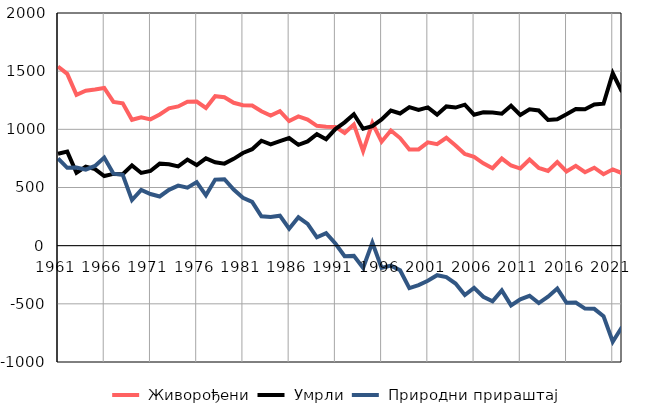
| Category |  Живорођени |  Умрли |  Природни прираштај |
|---|---|---|---|
| 1961.0 | 1540 | 790 | 750 |
| 1962.0 | 1477 | 808 | 669 |
| 1963.0 | 1297 | 626 | 671 |
| 1964.0 | 1332 | 679 | 653 |
| 1965.0 | 1343 | 658 | 685 |
| 1966.0 | 1356 | 599 | 757 |
| 1967.0 | 1236 | 617 | 619 |
| 1968.0 | 1223 | 614 | 609 |
| 1969.0 | 1082 | 690 | 392 |
| 1970.0 | 1104 | 625 | 479 |
| 1971.0 | 1086 | 642 | 444 |
| 1972.0 | 1128 | 705 | 423 |
| 1973.0 | 1180 | 700 | 480 |
| 1974.0 | 1197 | 681 | 516 |
| 1975.0 | 1238 | 740 | 498 |
| 1976.0 | 1239 | 693 | 546 |
| 1977.0 | 1184 | 751 | 433 |
| 1978.0 | 1285 | 717 | 568 |
| 1979.0 | 1276 | 705 | 571 |
| 1980.0 | 1228 | 746 | 482 |
| 1981.0 | 1208 | 797 | 411 |
| 1982.0 | 1205 | 829 | 376 |
| 1983.0 | 1155 | 902 | 253 |
| 1984.0 | 1118 | 871 | 247 |
| 1985.0 | 1156 | 898 | 258 |
| 1986.0 | 1071 | 925 | 146 |
| 1987.0 | 1111 | 867 | 244 |
| 1988.0 | 1083 | 896 | 187 |
| 1989.0 | 1030 | 958 | 72 |
| 1990.0 | 1023 | 915 | 108 |
| 1991.0 | 1021 | 1002 | 19 |
| 1992.0 | 969 | 1060 | -91 |
| 1993.0 | 1042 | 1130 | -88 |
| 1994.0 | 813 | 1005 | -192 |
| 1995.0 | 1054 | 1028 | 26 |
| 1996.0 | 894 | 1085 | -191 |
| 1997.0 | 990 | 1162 | -172 |
| 1998.0 | 925 | 1136 | -211 |
| 1999.0 | 826 | 1191 | -365 |
| 2000.0 | 827 | 1166 | -339 |
| 2001.0 | 888 | 1189 | -301 |
| 2002.0 | 872 | 1126 | -254 |
| 2003.0 | 927 | 1197 | -270 |
| 2004.0 | 861 | 1187 | -326 |
| 2005.0 | 788 | 1212 | -424 |
| 2006.0 | 763 | 1126 | -363 |
| 2007.0 | 708 | 1147 | -439 |
| 2008.0 | 666 | 1144 | -478 |
| 2009.0 | 749 | 1134 | -385 |
| 2010.0 | 689 | 1202 | -513 |
| 2011.0 | 663 | 1124 | -461 |
| 2012.0 | 741 | 1172 | -431 |
| 2013.0 | 668 | 1162 | -494 |
| 2014.0 | 642 | 1081 | -439 |
| 2015.0 | 718 | 1087 | -369 |
| 2016.0 | 638 | 1129 | -491 |
| 2017.0 | 686 | 1175 | -489 |
| 2018.0 | 631 | 1172 | -541 |
| 2019.0 | 670 | 1213 | -543 |
| 2020.0 | 614 | 1220 | -606 |
| 2021.0 | 656 | 1482 | -826 |
| 2022.0 | 623 | 1322 | -699 |